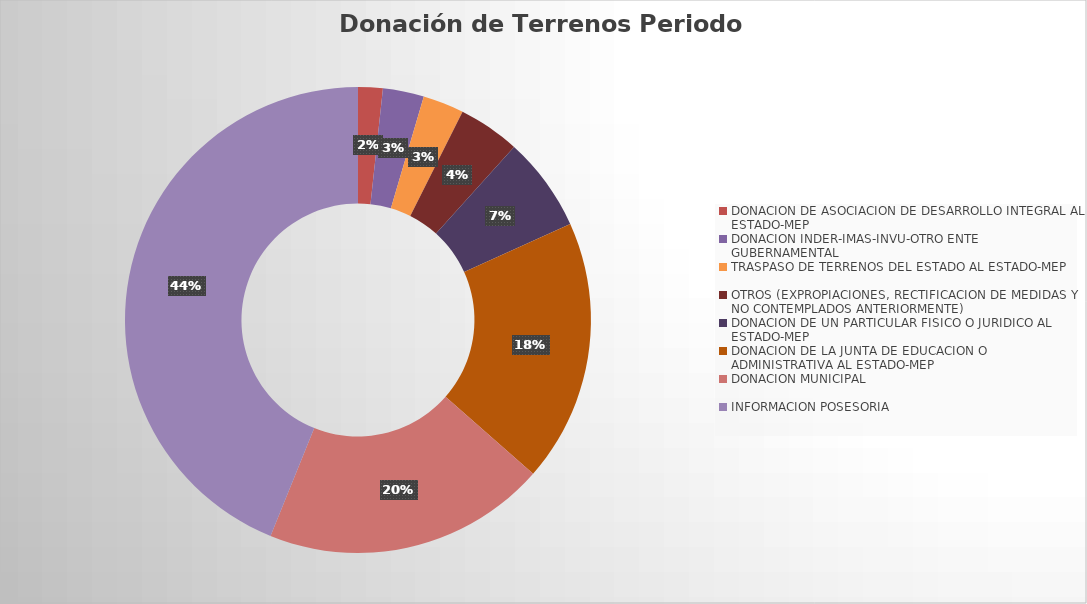
| Category | Series 0 |
|---|---|
| DONACION DE ASOCIACION DE DESARROLLO INTEGRAL AL ESTADO-MEP | 6 |
| DONACION INDER-IMAS-INVU-OTRO ENTE 
GUBERNAMENTAL | 10 |
| TRASPASO DE TERRENOS DEL ESTADO AL ESTADO-MEP | 10 |
| OTROS (EXPROPIACIONES, RECTIFICACION DE MEDIDAS Y NO CONTEMPLADOS ANTERIORMENTE) | 15 |
| DONACION DE UN PARTICULAR FISICO O JURIDICO AL ESTADO-MEP | 23 |
| DONACION DE LA JUNTA DE EDUCACION O ADMINISTRATIVA AL ESTADO-MEP | 64 |
| DONACION MUNICIPAL | 69 |
| INFORMACION POSESORIA | 154 |